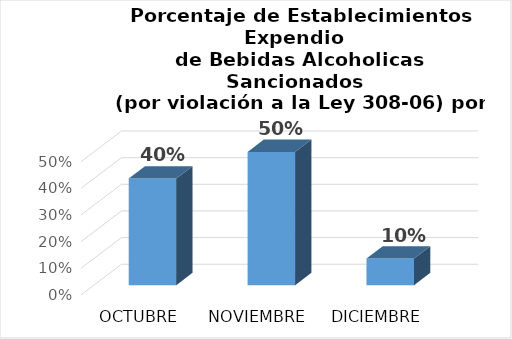
| Category | Series 0 |
|---|---|
| OCTUBRE | 0.4 |
| NOVIEMBRE | 0.5 |
| DICIEMBRE | 0.1 |